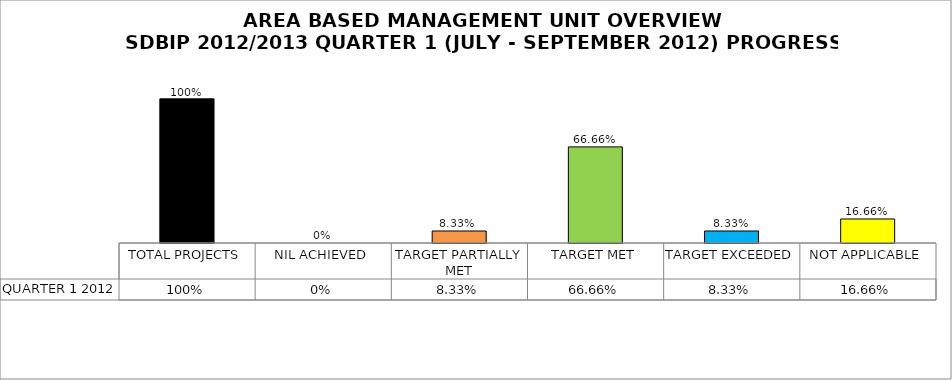
| Category | QUARTER 1 2012 |
|---|---|
| TOTAL PROJECTS | 1 |
| NIL ACHIEVED | 0 |
| TARGET PARTIALLY MET | 0.083 |
| TARGET MET | 0.667 |
| TARGET EXCEEDED | 0.083 |
| NOT APPLICABLE | 0.167 |